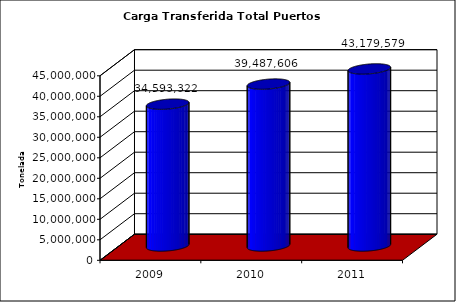
| Category | Series 0 |
|---|---|
| 2009.0 | 34593321.913 |
| 2010.0 | 39487606.434 |
| 2011.0 | 43179579.311 |